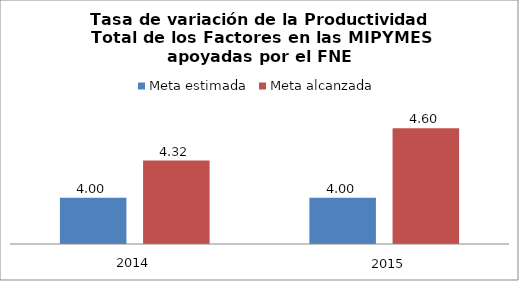
| Category | Meta estimada | Meta alcanzada |
|---|---|---|
| 0 | 4 | 4.32 |
| 1 | 4 | 4.6 |